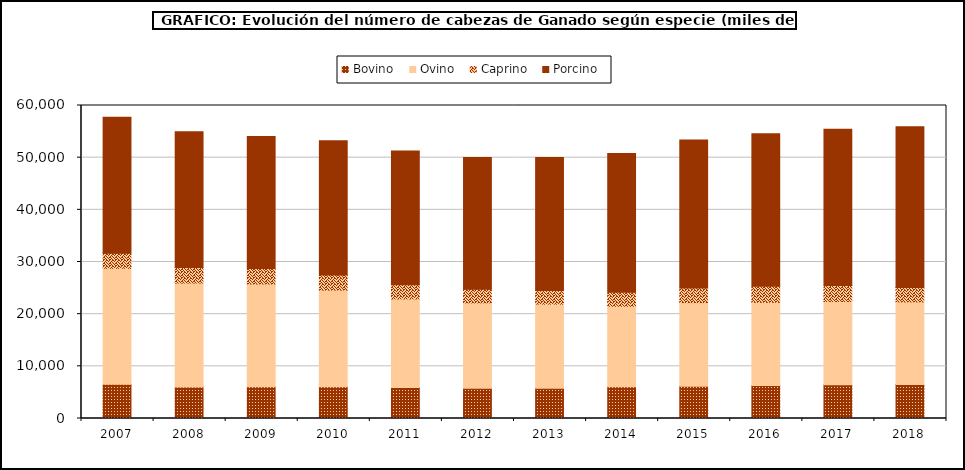
| Category | Bovino | Ovino | Caprino | Porcino |
|---|---|---|---|---|
| 2007.0 | 6584.98 | 22194.257 | 2891.574 | 26061.232 |
| 2008.0 | 6020 | 19952.282 | 2959.329 | 26025.672 |
| 2009.0 | 6082.442 | 19718.195 | 2933.782 | 25342.606 |
| 2010.0 | 6075 | 18552 | 2904 | 25704 |
| 2011.0 | 5923 | 17003 | 2693 | 25635 |
| 2012.0 | 5812.605 | 16339.373 | 2637.336 | 25250.377 |
| 2013.0 | 5802.22 | 16118.586 | 2609.989 | 25494.715 |
| 2014.0 | 6078.733 | 15431.804 | 2704.228 | 26567.578 |
| 2015.0 | 6182.908 | 16026.374 | 2801.064 | 28367.335 |
| 2016.0 | 6317.641 | 15962.892 | 3088.035 | 29231.595 |
| 2017.0 | 6465.747 | 15963.106 | 3059.731 | 29971.357 |
| 2018.0 | 6510.592 | 15852.525 | 2764.79 | 30804.102 |